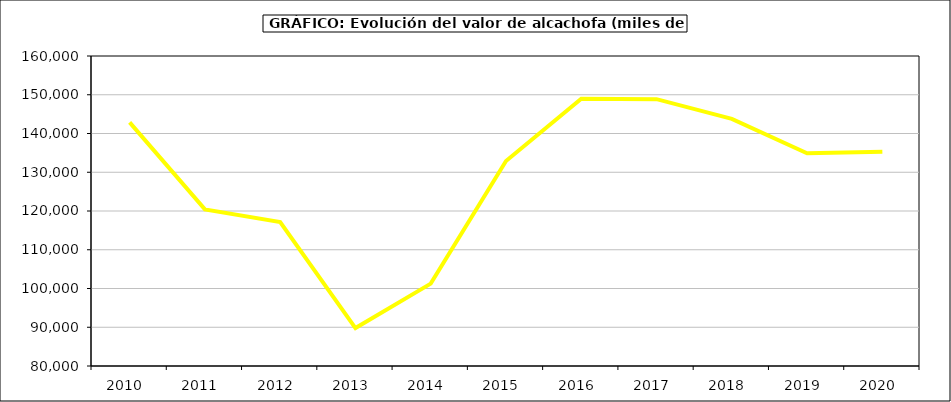
| Category | Valor |
|---|---|
| 2010.0 | 142879.333 |
| 2011.0 | 120418 |
| 2012.0 | 117146.597 |
| 2013.0 | 89795.299 |
| 2014.0 | 101254.898 |
| 2015.0 | 132897 |
| 2016.0 | 148974 |
| 2017.0 | 148863.365 |
| 2018.0 | 143776.931 |
| 2019.0 | 134882.222 |
| 2020.0 | 135314.955 |